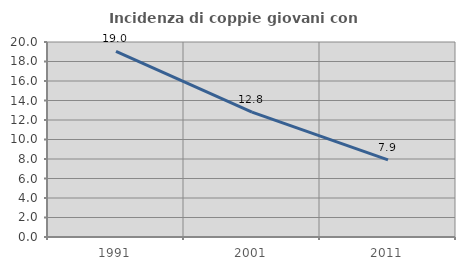
| Category | Incidenza di coppie giovani con figli |
|---|---|
| 1991.0 | 19.035 |
| 2001.0 | 12.808 |
| 2011.0 | 7.904 |